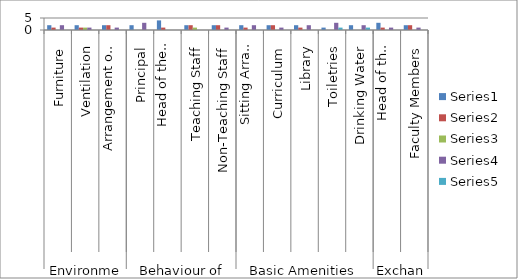
| Category | Series 0 | Series 1 | Series 2 | Series 3 | Series 4 |
|---|---|---|---|---|---|
| 0 | 2 | 1 | 0 | 2 | 0 |
| 1 | 2 | 1 | 1 | 1 | 0 |
| 2 | 2 | 2 | 0 | 1 | 0 |
| 3 | 2 | 0 | 0 | 3 | 0 |
| 4 | 4 | 1 | 0 | 0 | 0 |
| 5 | 2 | 2 | 1 | 0 | 0 |
| 6 | 2 | 2 | 0 | 1 | 0 |
| 7 | 2 | 1 | 0 | 2 | 0 |
| 8 | 2 | 2 | 0 | 1 | 0 |
| 9 | 2 | 1 | 0 | 2 | 0 |
| 10 | 1 | 0 | 0 | 3 | 1 |
| 11 | 2 | 0 | 0 | 2 | 1 |
| 12 | 3 | 1 | 0 | 1 | 0 |
| 13 | 2 | 2 | 0 | 1 | 0 |